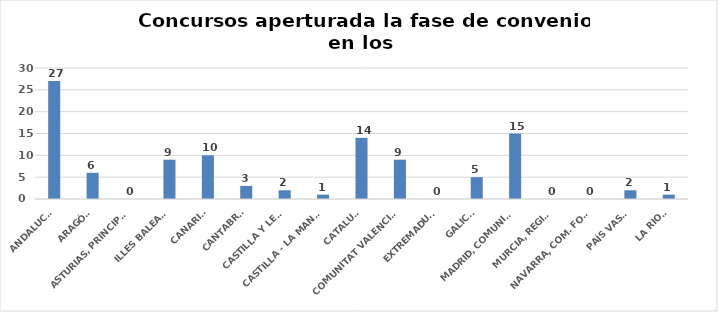
| Category | Series 0 |
|---|---|
| ANDALUCÍA | 27 |
| ARAGÓN | 6 |
| ASTURIAS, PRINCIPADO | 0 |
| ILLES BALEARS | 9 |
| CANARIAS | 10 |
| CANTABRIA | 3 |
| CASTILLA Y LEÓN | 2 |
| CASTILLA - LA MANCHA | 1 |
| CATALUÑA | 14 |
| COMUNITAT VALENCIANA | 9 |
| EXTREMADURA | 0 |
| GALICIA | 5 |
| MADRID, COMUNIDAD | 15 |
| MURCIA, REGIÓN | 0 |
| NAVARRA, COM. FORAL | 0 |
| PAÍS VASCO | 2 |
| LA RIOJA | 1 |